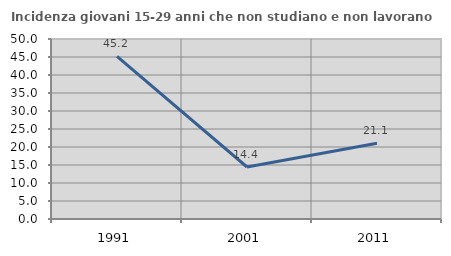
| Category | Incidenza giovani 15-29 anni che non studiano e non lavorano  |
|---|---|
| 1991.0 | 45.188 |
| 2001.0 | 14.444 |
| 2011.0 | 21.053 |